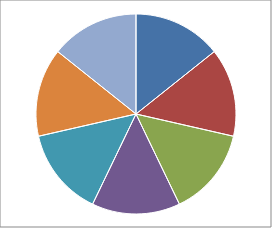
| Category | Series 1 | Series 2 | Series 3 |
|---|---|---|---|
| Point 1 | 1 | 1 | 1 |
| Point 2 | 1 | 1 | 1 |
| Point 3 | 1 | 1 | 1 |
| Point 4 | 1 | 1 | 1 |
| Point 5 | 1 | 1 | 1 |
| Point 6 | 1 | 1 | 1 |
| Point 7 | 1 | 1 | 1 |